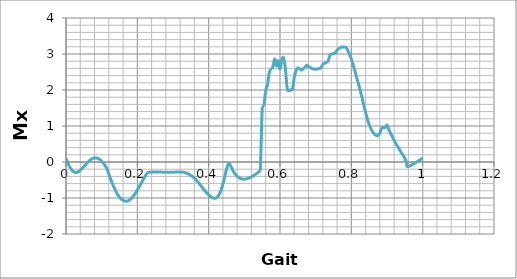
| Category | Series 0 |
|---|---|
| 0.0 | 0.104 |
| 0.005 | -0.02 |
| 0.01 | -0.129 |
| 0.015 | -0.204 |
| 0.02 | -0.26 |
| 0.025 | -0.288 |
| 0.03 | -0.29 |
| 0.035 | -0.268 |
| 0.04 | -0.231 |
| 0.045 | -0.182 |
| 0.05 | -0.127 |
| 0.055 | -0.071 |
| 0.06 | -0.018 |
| 0.065 | 0.03 |
| 0.07 | 0.07 |
| 0.075 | 0.098 |
| 0.08 | 0.113 |
| 0.085 | 0.113 |
| 0.09 | 0.099 |
| 0.095 | 0.069 |
| 0.1 | 0.016 |
| 0.105 | -0.034 |
| 0.11 | -0.108 |
| 0.115 | -0.194 |
| 0.12 | -0.335 |
| 0.125 | -0.474 |
| 0.13 | -0.599 |
| 0.135 | -0.715 |
| 0.14 | -0.818 |
| 0.145 | -0.907 |
| 0.15 | -0.979 |
| 0.155 | -1.03 |
| 0.16 | -1.064 |
| 0.165 | -1.086 |
| 0.17 | -1.09 |
| 0.175 | -1.074 |
| 0.18 | -1.042 |
| 0.185 | -0.994 |
| 0.19 | -0.932 |
| 0.195 | -0.86 |
| 0.2 | -0.779 |
| 0.205 | -0.693 |
| 0.21 | -0.604 |
| 0.215 | -0.515 |
| 0.22 | -0.427 |
| 0.225 | -0.344 |
| 0.23 | -0.288 |
| 0.235 | -0.285 |
| 0.24 | -0.279 |
| 0.245 | -0.276 |
| 0.25 | -0.276 |
| 0.255 | -0.277 |
| 0.26 | -0.278 |
| 0.265 | -0.279 |
| 0.27 | -0.281 |
| 0.275 | -0.283 |
| 0.28 | -0.284 |
| 0.285 | -0.285 |
| 0.29 | -0.285 |
| 0.295 | -0.284 |
| 0.3 | -0.282 |
| 0.305 | -0.281 |
| 0.31 | -0.275 |
| 0.315 | -0.281 |
| 0.32 | -0.28 |
| 0.325 | -0.278 |
| 0.33 | -0.287 |
| 0.335 | -0.301 |
| 0.34 | -0.316 |
| 0.345 | -0.341 |
| 0.35 | -0.373 |
| 0.355 | -0.408 |
| 0.36 | -0.45 |
| 0.365 | -0.499 |
| 0.37 | -0.556 |
| 0.375 | -0.616 |
| 0.38 | -0.68 |
| 0.385 | -0.745 |
| 0.39 | -0.808 |
| 0.395 | -0.865 |
| 0.4 | -0.911 |
| 0.405 | -0.953 |
| 0.41 | -0.99 |
| 0.415 | -1.008 |
| 0.42 | -1.003 |
| 0.425 | -0.967 |
| 0.43 | -0.892 |
| 0.435 | -0.772 |
| 0.44 | -0.608 |
| 0.445 | -0.41 |
| 0.45 | -0.205 |
| 0.455 | -0.055 |
| 0.46 | -0.075 |
| 0.465 | -0.177 |
| 0.47 | -0.275 |
| 0.475 | -0.346 |
| 0.48 | -0.397 |
| 0.485 | -0.435 |
| 0.49 | -0.46 |
| 0.495 | -0.474 |
| 0.5 | -0.477 |
| 0.505 | -0.471 |
| 0.51 | -0.457 |
| 0.515 | -0.437 |
| 0.52 | -0.412 |
| 0.525 | -0.383 |
| 0.53 | -0.35 |
| 0.535 | -0.315 |
| 0.54 | -0.278 |
| 0.545 | -0.243 |
| 0.55 | 1.529 |
| 0.555 | 1.553 |
| 0.56 | 1.983 |
| 0.565 | 2.155 |
| 0.57 | 2.489 |
| 0.575 | 2.581 |
| 0.58 | 2.644 |
| 0.585 | 2.864 |
| 0.59 | 2.671 |
| 0.595 | 2.814 |
| 0.6 | 2.585 |
| 0.605 | 2.84 |
| 0.61 | 2.887 |
| 0.615 | 2.593 |
| 0.62 | 2.058 |
| 0.625 | 1.985 |
| 0.63 | 2.008 |
| 0.635 | 2.03 |
| 0.64 | 2.351 |
| 0.645 | 2.541 |
| 0.65 | 2.616 |
| 0.655 | 2.588 |
| 0.66 | 2.552 |
| 0.665 | 2.588 |
| 0.67 | 2.632 |
| 0.675 | 2.691 |
| 0.68 | 2.645 |
| 0.685 | 2.629 |
| 0.69 | 2.593 |
| 0.695 | 2.581 |
| 0.7 | 2.579 |
| 0.705 | 2.585 |
| 0.71 | 2.597 |
| 0.715 | 2.616 |
| 0.72 | 2.716 |
| 0.725 | 2.741 |
| 0.73 | 2.769 |
| 0.735 | 2.799 |
| 0.74 | 2.973 |
| 0.745 | 2.998 |
| 0.75 | 3.019 |
| 0.755 | 3.034 |
| 0.76 | 3.107 |
| 0.765 | 3.149 |
| 0.77 | 3.181 |
| 0.775 | 3.196 |
| 0.78 | 3.192 |
| 0.785 | 3.182 |
| 0.79 | 3.1 |
| 0.795 | 2.991 |
| 0.8 | 2.857 |
| 0.805 | 2.701 |
| 0.81 | 2.527 |
| 0.815 | 2.346 |
| 0.82 | 2.176 |
| 0.825 | 1.98 |
| 0.83 | 1.786 |
| 0.835 | 1.577 |
| 0.84 | 1.377 |
| 0.845 | 1.184 |
| 0.85 | 1.042 |
| 0.855 | 0.925 |
| 0.86 | 0.834 |
| 0.865 | 0.771 |
| 0.87 | 0.739 |
| 0.875 | 0.735 |
| 0.88 | 0.804 |
| 0.885 | 0.932 |
| 0.89 | 0.957 |
| 0.895 | 0.961 |
| 0.9 | 1.027 |
| 0.905 | 0.902 |
| 0.91 | 0.797 |
| 0.915 | 0.701 |
| 0.92 | 0.602 |
| 0.925 | 0.508 |
| 0.93 | 0.43 |
| 0.935 | 0.347 |
| 0.94 | 0.261 |
| 0.945 | 0.189 |
| 0.95 | 0.102 |
| 0.955 | -0.012 |
| 0.96 | -0.126 |
| 1.0 | 0.104 |